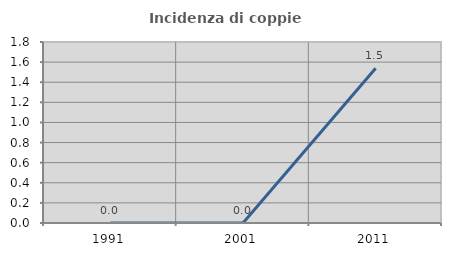
| Category | Incidenza di coppie miste |
|---|---|
| 1991.0 | 0 |
| 2001.0 | 0 |
| 2011.0 | 1.538 |